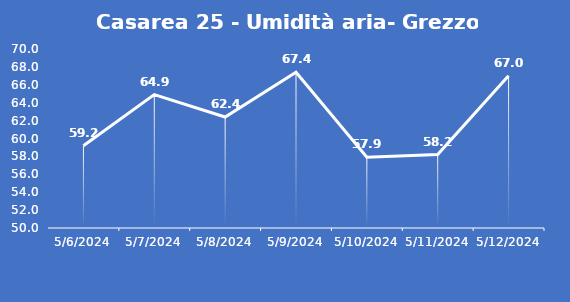
| Category | Casarea 25 - Umidità aria- Grezzo (%) |
|---|---|
| 5/6/24 | 59.2 |
| 5/7/24 | 64.9 |
| 5/8/24 | 62.4 |
| 5/9/24 | 67.4 |
| 5/10/24 | 57.9 |
| 5/11/24 | 58.2 |
| 5/12/24 | 67 |